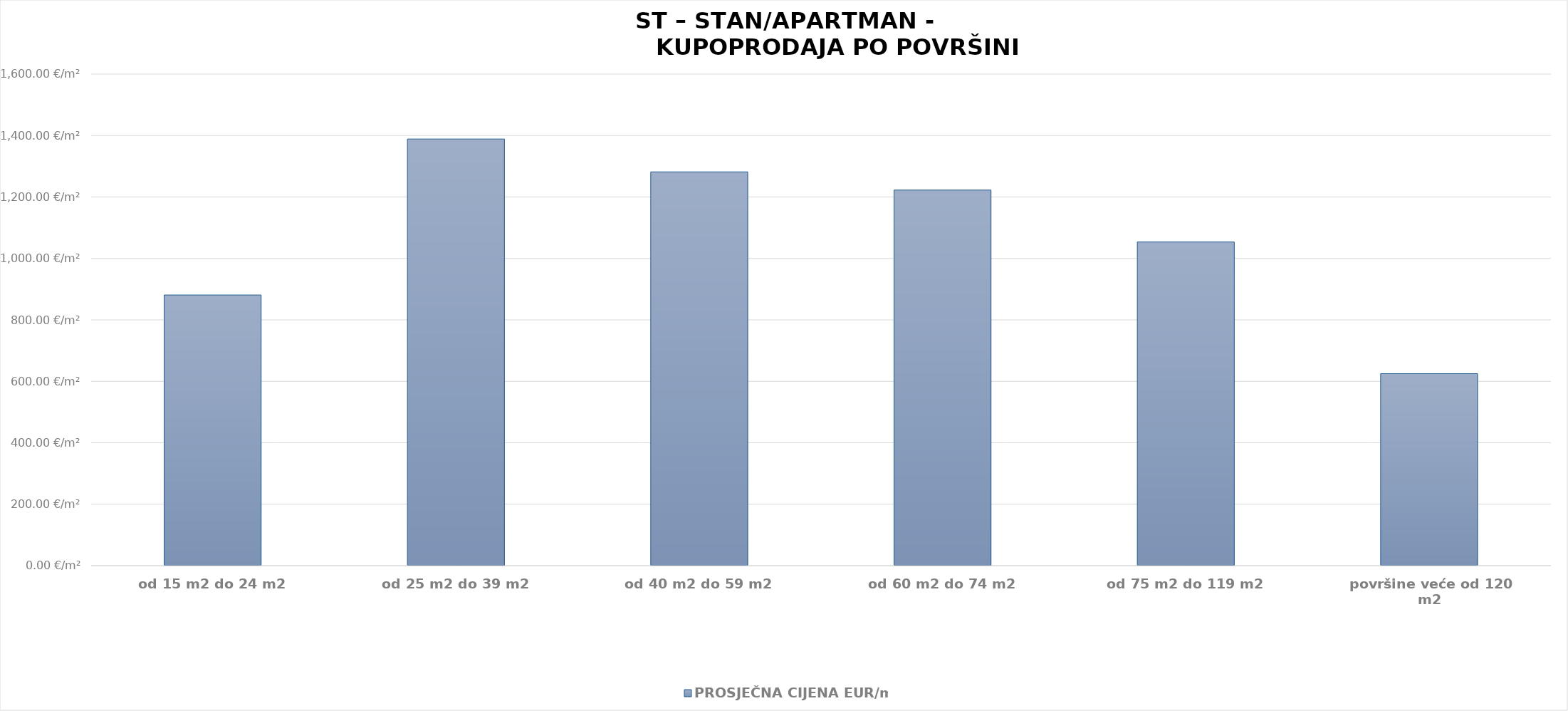
| Category | PROSJEČNA CIJENA EUR/m2 |
|---|---|
| od 15 m2 do 24 m2 | 1902-05-30 00:10:25 |
| od 25 m2 do 39 m2 | 1903-10-19 15:27:40 |
| od 40 m2 do 59 m2 | 1903-07-04 18:01:29 |
| od 60 m2 do 74 m2 | 1903-05-06 12:01:03 |
| od 75 m2 do 119 m2 | 1902-11-18 13:04:12 |
| površine veće od 120 m2 | 1901-09-15 22:45:00 |